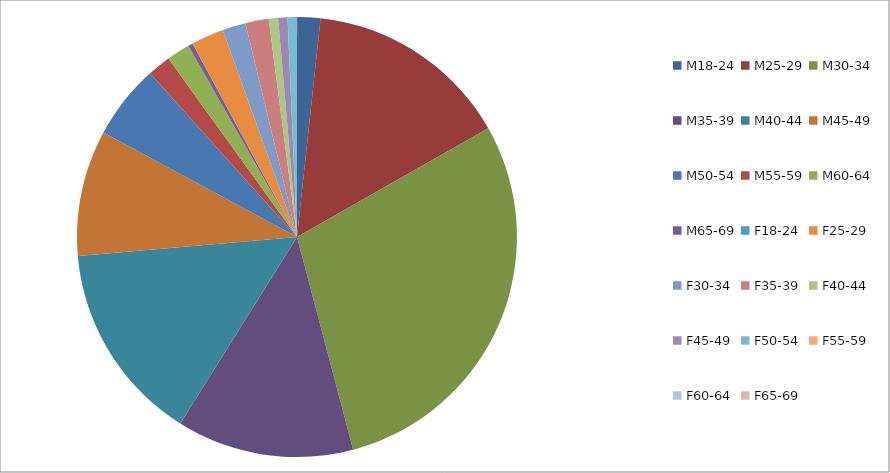
| Category | Series 0 |
|---|---|
| M18-24 | 5 |
| M25-29 | 44 |
| M30-34 | 85 |
| M35-39 | 38 |
| M40-44 | 43 |
| M45-49 | 27 |
| M50-54 | 16 |
| M55-59 | 5 |
| M60-64 | 5 |
| M65-69 | 1 |
| F18-24 | 0 |
| F25-29 | 7 |
| F30-34 | 5 |
| F35-39 | 5 |
| F40-44 | 2 |
| F45-49 | 2 |
| F50-54 | 2 |
| F55-59 | 0 |
| F60-64 | 0 |
| F65-69 | 0 |